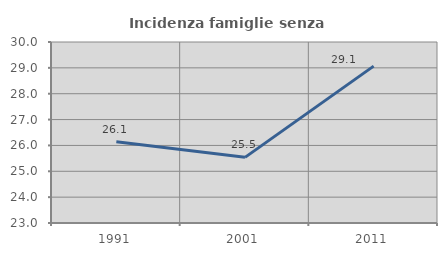
| Category | Incidenza famiglie senza nuclei |
|---|---|
| 1991.0 | 26.145 |
| 2001.0 | 25.538 |
| 2011.0 | 29.066 |